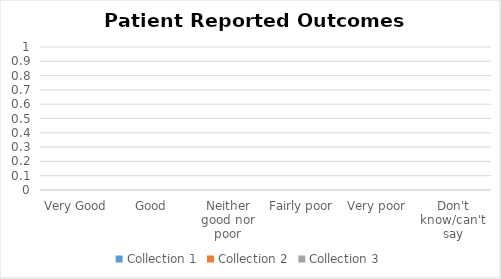
| Category | Collection 1 | Collection 2 | Collection 3 |
|---|---|---|---|
| Very Good | 0 | 0 | 0 |
| Good | 0 | 0 | 0 |
| Neither good nor poor | 0 | 0 | 0 |
| Fairly poor | 0 | 0 | 0 |
| Very poor | 0 | 0 | 0 |
| Don't know/can't say | 0 | 0 | 0 |